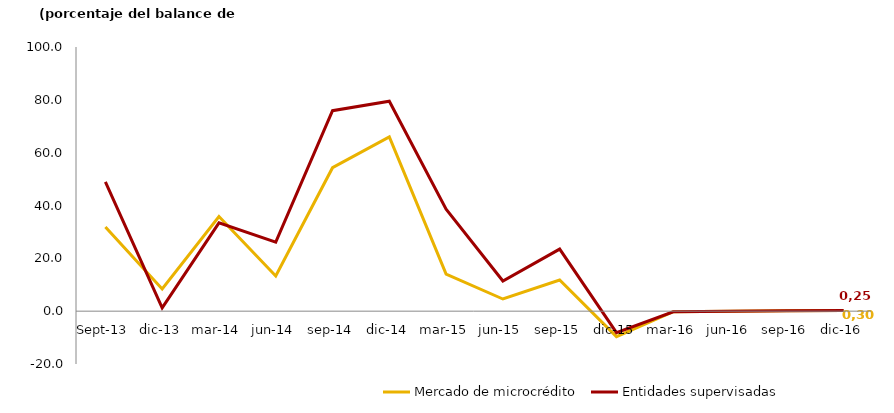
| Category | Mercado de microcrédito | Entidades supervisadas |
|---|---|---|
| sep-13 | 31.832 | 48.907 |
| dic-13 | 8.424 | 1.249 |
| mar-14 | 35.824 | 33.423 |
| jun-14 | 13.3 | 26.101 |
| sep-14 | 54.3 | 75.891 |
| dic-14 | 66 | 79.452 |
| mar-15 | 14 | 38.637 |
| jun-15 | 4.6 | 11.4 |
| sep-15 | 11.8 | 23.5 |
| dic-15 | -9.635 | -8.111 |
| mar-16 | -0.204 | -0.209 |
| jun-16 | -0.014 | -0.008 |
| sep-16 | 0.131 | 0.13 |
| dic-16 | 0.297 | 0.253 |